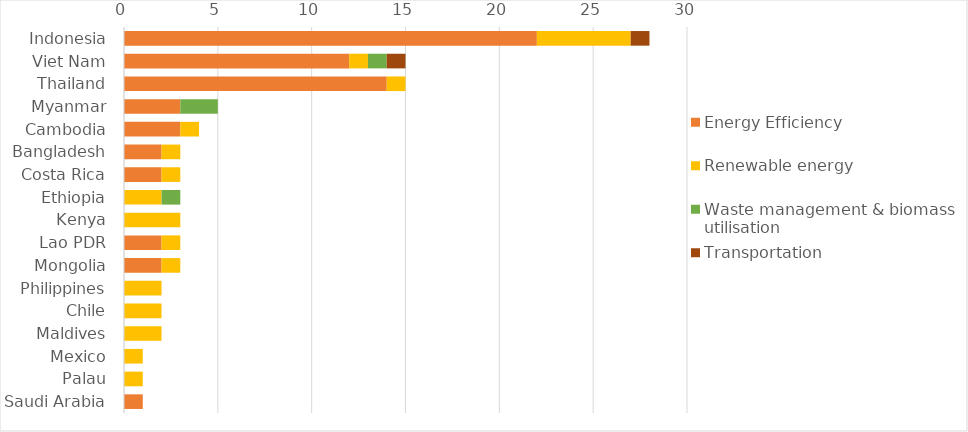
| Category | Energy Efficiency | Renewable energy | Waste management & biomass utilisation | Transportation |
|---|---|---|---|---|
| Indonesia | 22 | 5 | 0 | 1 |
| Viet Nam | 12 | 1 | 1 | 1 |
| Thailand | 14 | 1 | 0 | 0 |
| Myanmar | 3 | 0 | 2 | 0 |
| Cambodia | 3 | 1 | 0 | 0 |
| Bangladesh | 2 | 1 | 0 | 0 |
| Costa Rica | 2 | 1 | 0 | 0 |
| Ethiopia | 0 | 2 | 1 | 0 |
| Kenya | 0 | 3 | 0 | 0 |
| Lao PDR | 2 | 1 | 0 | 0 |
| Mongolia | 2 | 1 | 0 | 0 |
| Philippines | 0 | 2 | 0 | 0 |
| Chile | 0 | 2 | 0 | 0 |
| Maldives | 0 | 2 | 0 | 0 |
| Mexico | 0 | 1 | 0 | 0 |
| Palau | 0 | 1 | 0 | 0 |
| Saudi Arabia | 1 | 0 | 0 | 0 |